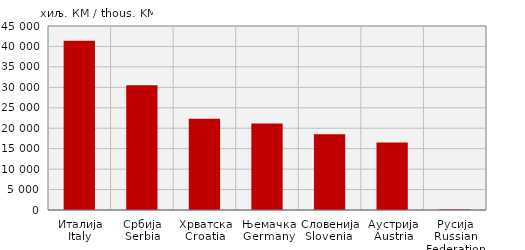
| Category | Извоз
Export |
|---|---|
| Италија
Italy | 41373 |
| Србија
Serbia | 30480 |
| Хрватска
Croatia | 22343 |
| Њемачка
Germany | 21158 |
| Словенија
Slovenia  | 18537 |
| Аустрија
Austria | 16527 |
| Русија
Russian Federation | 134 |